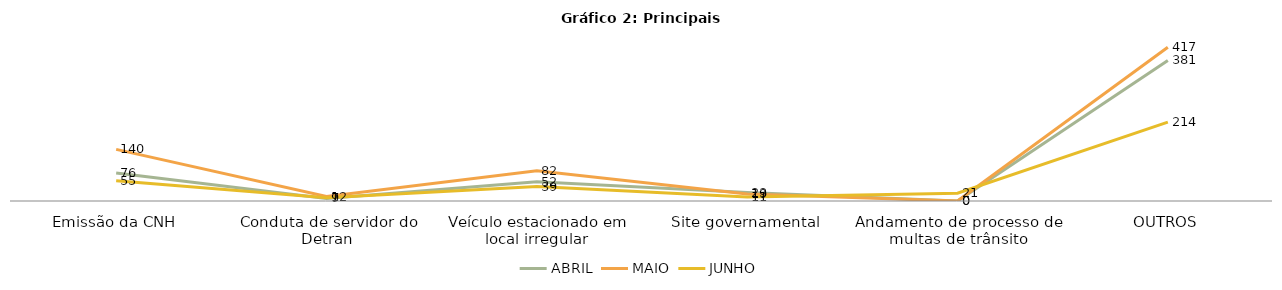
| Category | ABRIL | MAIO | JUNHO |
|---|---|---|---|
| Emissão da CNH | 76 | 140 | 55 |
| Conduta de servidor do Detran | 7 | 12 | 9 |
| Veículo estacionado em local irregular | 52 | 82 | 39 |
| Site governamental | 23 | 19 | 11 |
| Andamento de processo de multas de trânsito | 0 | 0 | 21 |
| OUTROS | 381 | 417 | 214 |